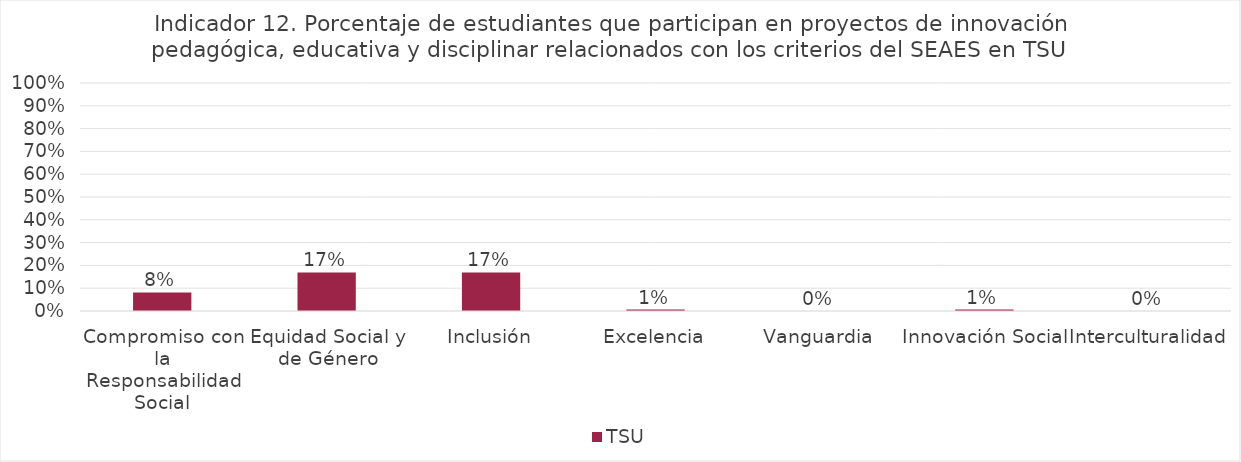
| Category | TSU |
|---|---|
| Compromiso con la Responsabilidad Social | 0.081 |
| Equidad Social y de Género | 0.169 |
| Inclusión | 0.169 |
| Excelencia | 0.006 |
| Vanguardia | 0 |
| Innovación Social | 0.006 |
| Interculturalidad | 0 |